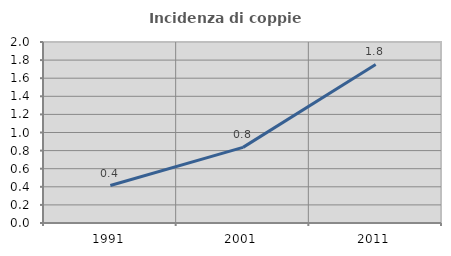
| Category | Incidenza di coppie miste |
|---|---|
| 1991.0 | 0.414 |
| 2001.0 | 0.836 |
| 2011.0 | 1.752 |